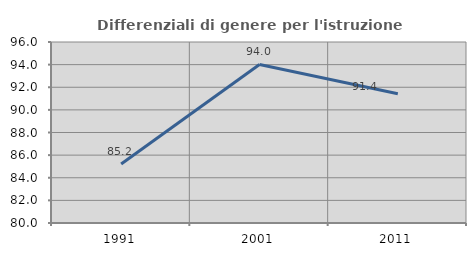
| Category | Differenziali di genere per l'istruzione superiore |
|---|---|
| 1991.0 | 85.219 |
| 2001.0 | 94.014 |
| 2011.0 | 91.432 |